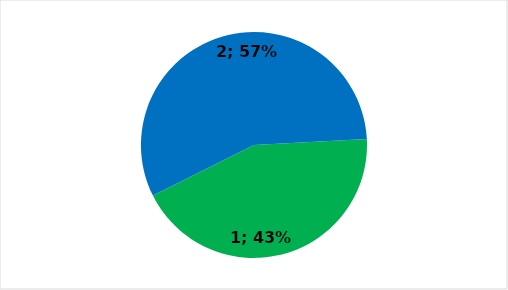
| Category | Series 0 |
|---|---|
| 0 | 239 |
| 1 | 311 |